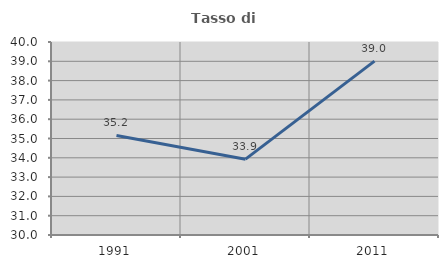
| Category | Tasso di occupazione   |
|---|---|
| 1991.0 | 35.156 |
| 2001.0 | 33.929 |
| 2011.0 | 39.007 |